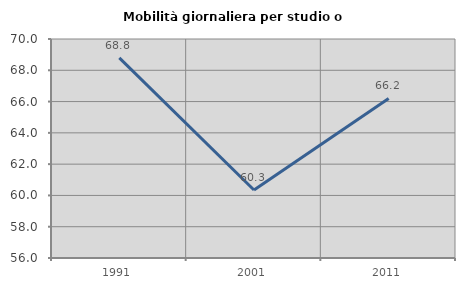
| Category | Mobilità giornaliera per studio o lavoro |
|---|---|
| 1991.0 | 68.797 |
| 2001.0 | 60.349 |
| 2011.0 | 66.197 |